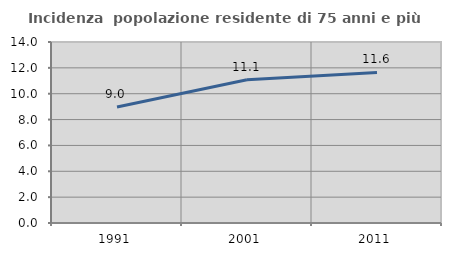
| Category | Incidenza  popolazione residente di 75 anni e più |
|---|---|
| 1991.0 | 8.976 |
| 2001.0 | 11.08 |
| 2011.0 | 11.645 |